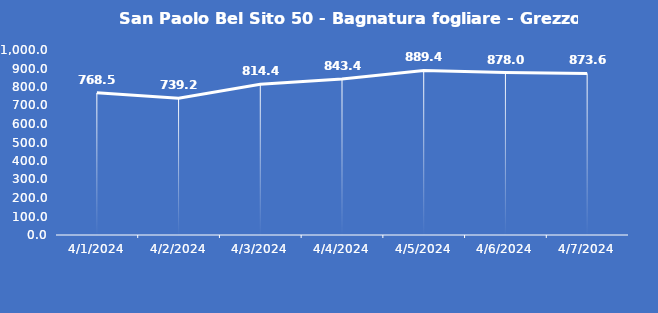
| Category | San Paolo Bel Sito 50 - Bagnatura fogliare - Grezzo (min) |
|---|---|
| 4/1/24 | 768.5 |
| 4/2/24 | 739.2 |
| 4/3/24 | 814.4 |
| 4/4/24 | 843.4 |
| 4/5/24 | 889.4 |
| 4/6/24 | 878 |
| 4/7/24 | 873.6 |